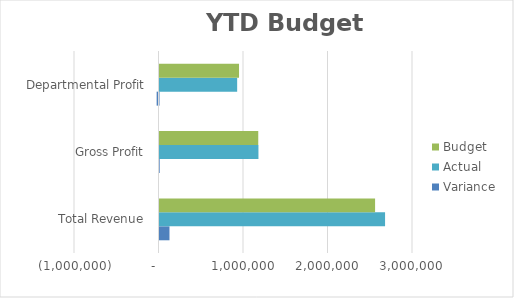
| Category | Variance | Actual | Budget |
|---|---|---|---|
| Total Revenue | 118101.8 | 2669403.98 | 2551302.18 |
| Gross Profit | 2171.76 | 1170906.78 | 1168735.02 |
| Departmental Profit | -22063.29 | 919083.19 | 941146.48 |